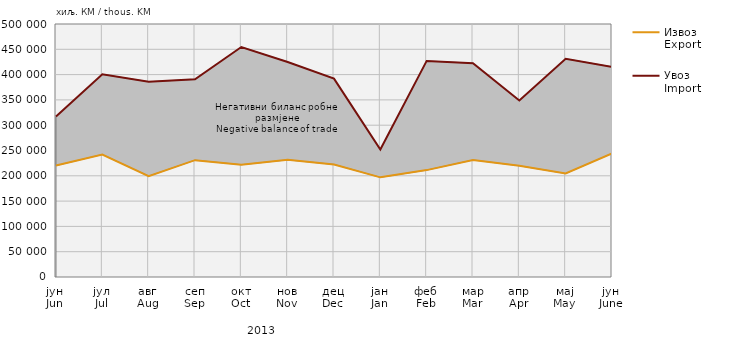
| Category | Извоз
Export | Увоз
Import |
|---|---|---|
| јун
Jun | 220173 | 317176 |
| јул
Jul | 242098 | 400481 |
| авг
Aug | 199427 | 385911 |
| сеп
Sep | 230912 | 390579 |
| окт
Oct | 221870 | 454480 |
| нов
Nov | 231500 | 424992 |
| дец
Dec | 222497 | 391993 |
| јан
Jan | 196950 | 251909 |
| феб
Feb | 211260 | 427058 |
| мар
Mar | 231286 | 422482 |
| апр
Apr | 219816 | 348984 |
| мај
May | 204515 | 431234 |
| јун
June | 244235 | 415372 |